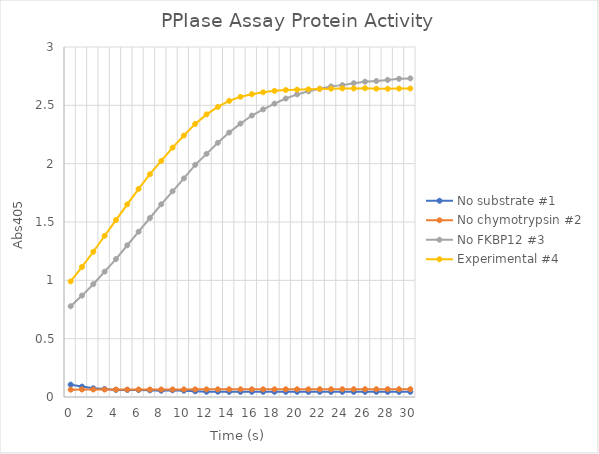
| Category | No substrate #1 | No chymotrypsin #2 | No FKBP12 #3 | Experimental #4 |
|---|---|---|---|---|
| 0.0 | 0.106 | 0.063 | 0.778 | 0.991 |
| 1.0 | 0.089 | 0.064 | 0.869 | 1.115 |
| 2.0 | 0.075 | 0.064 | 0.967 | 1.245 |
| 3.0 | 0.068 | 0.064 | 1.075 | 1.382 |
| 4.0 | 0.061 | 0.064 | 1.182 | 1.517 |
| 5.0 | 0.06 | 0.064 | 1.301 | 1.651 |
| 6.0 | 0.06 | 0.064 | 1.417 | 1.783 |
| 7.0 | 0.057 | 0.064 | 1.534 | 1.91 |
| 8.0 | 0.054 | 0.065 | 1.652 | 2.024 |
| 9.0 | 0.058 | 0.065 | 1.763 | 2.137 |
| 10.0 | 0.054 | 0.065 | 1.874 | 2.241 |
| 11.0 | 0.049 | 0.065 | 1.99 | 2.341 |
| 12.0 | 0.045 | 0.066 | 2.084 | 2.422 |
| 13.0 | 0.046 | 0.066 | 2.179 | 2.486 |
| 14.0 | 0.045 | 0.066 | 2.267 | 2.538 |
| 15.0 | 0.044 | 0.066 | 2.343 | 2.573 |
| 16.0 | 0.045 | 0.066 | 2.412 | 2.596 |
| 17.0 | 0.044 | 0.066 | 2.466 | 2.612 |
| 18.0 | 0.044 | 0.066 | 2.514 | 2.624 |
| 19.0 | 0.044 | 0.066 | 2.558 | 2.631 |
| 20.0 | 0.044 | 0.066 | 2.594 | 2.634 |
| 21.0 | 0.044 | 0.066 | 2.62 | 2.637 |
| 22.0 | 0.044 | 0.067 | 2.643 | 2.641 |
| 23.0 | 0.044 | 0.067 | 2.662 | 2.643 |
| 24.0 | 0.044 | 0.067 | 2.673 | 2.645 |
| 25.0 | 0.044 | 0.067 | 2.69 | 2.645 |
| 26.0 | 0.044 | 0.067 | 2.703 | 2.647 |
| 27.0 | 0.044 | 0.067 | 2.708 | 2.643 |
| 28.0 | 0.044 | 0.067 | 2.718 | 2.642 |
| 29.0 | 0.044 | 0.067 | 2.727 | 2.644 |
| 30.0 | 0.044 | 0.067 | 2.731 | 2.644 |